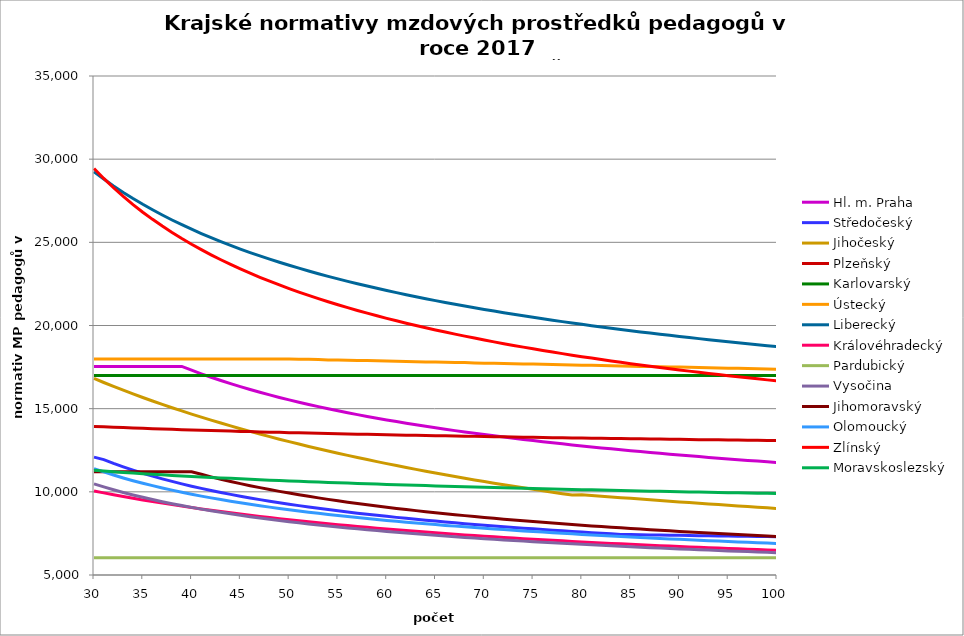
| Category | Hl. m. Praha | Středočeský | Jihočeský | Plzeňský | Karlovarský  | Ústecký   | Liberecký | Královéhradecký | Pardubický | Vysočina | Jihomoravský | Olomoucký | Zlínský | Moravskoslezský |
|---|---|---|---|---|---|---|---|---|---|---|---|---|---|---|
| 30.0 | 17540.399 | 12085.225 | 16815.122 | 13934.228 | 17000 | 17988.82 | 29246.191 | 10051.47 | 6030.48 | 10478.142 | 11210.627 | 11392.527 | 29442.645 | 11294.621 |
| 31.0 | 17540.399 | 11937.305 | 16573.35 | 13910.151 | 17000 | 17988.82 | 28805.839 | 9937.875 | 6030.48 | 10295.455 | 11210.627 | 11195.68 | 28840.823 | 11250.532 |
| 32.0 | 17540.399 | 11711.932 | 16338.432 | 13886.158 | 17000 | 17988.82 | 28391.923 | 9826.82 | 6030.48 | 10124.198 | 11210.627 | 11009.416 | 28281.099 | 11206.787 |
| 33.0 | 17540.399 | 11501.47 | 16110.08 | 13862.247 | 17000 | 17988.82 | 28001.94 | 9718.219 | 6030.48 | 9963.865 | 11210.627 | 10833.02 | 27758.95 | 11167.312 |
| 34.0 | 17540.399 | 11304.396 | 15888.024 | 13838.419 | 17000 | 17988.82 | 27633.704 | 9614.995 | 6030.48 | 9812.78 | 11210.627 | 10669.503 | 27270.491 | 11128.115 |
| 35.0 | 17540.399 | 11119.392 | 15672.006 | 13820.601 | 17000 | 17988.82 | 27285.294 | 9513.941 | 6030.48 | 9670.631 | 11210.627 | 10514.402 | 26812.366 | 11093.072 |
| 36.0 | 17540.399 | 10945.311 | 15461.783 | 13796.915 | 17000 | 17988.82 | 26955.016 | 9414.989 | 6030.48 | 9536.268 | 11210.627 | 10370.657 | 26381.659 | 11058.249 |
| 37.0 | 17540.399 | 10781.15 | 15257.125 | 13779.204 | 17000 | 17988.82 | 26641.368 | 9320.896 | 6030.48 | 9409.216 | 11210.627 | 10230.789 | 25975.823 | 11023.644 |
| 38.0 | 17540.399 | 10626.029 | 15057.815 | 13755.66 | 17000 | 17988.82 | 26343.017 | 9231.434 | 6030.48 | 9288.769 | 11210.627 | 10101.202 | 25592.626 | 10989.255 |
| 39.0 | 17540.399 | 10479.169 | 14863.644 | 13738.055 | 17000 | 17988.82 | 26058.771 | 9140.956 | 6030.48 | 9174.285 | 11210.627 | 9974.856 | 25230.097 | 10955.079 |
| 40.0 | 17313.023 | 10339.882 | 14674.418 | 13720.494 | 17000 | 17988.82 | 25787.563 | 9054.898 | 6030.48 | 9065.439 | 11210.627 | 9857.876 | 24886.497 | 10924.879 |
| 41.0 | 17095.727 | 10207.556 | 14489.949 | 13702.979 | 17000 | 17988.82 | 25528.436 | 8973.061 | 6030.48 | 8961.678 | 11053.999 | 9743.609 | 24560.279 | 10894.845 |
| 42.0 | 16888.863 | 10081.644 | 14310.06 | 13685.508 | 17000 | 17988.82 | 25280.526 | 8890.121 | 6030.48 | 8862.741 | 10901.688 | 9637.93 | 24250.063 | 10864.976 |
| 43.0 | 16691.642 | 9961.656 | 14134.583 | 13668.081 | 17000 | 17988.82 | 25043.052 | 8813.746 | 6030.48 | 8768.146 | 10760.83 | 9534.519 | 23954.618 | 10835.27 |
| 44.0 | 16503.353 | 9847.154 | 13963.357 | 13650.699 | 17000 | 17988.82 | 24815.307 | 8736.191 | 6030.48 | 8677.686 | 10623.565 | 9436.165 | 23672.835 | 10809.41 |
| 45.0 | 16323.356 | 9737.741 | 13796.23 | 13633.362 | 17000 | 17988.82 | 24596.649 | 8662.426 | 6030.48 | 8591.168 | 10493.236 | 9342.625 | 23403.721 | 10780.007 |
| 46.0 | 16151.074 | 9633.06 | 13633.057 | 13621.827 | 17000 | 17988.82 | 24386.493 | 8589.897 | 6030.48 | 8507.955 | 10369.463 | 9250.922 | 23146.374 | 10754.41 |
| 47.0 | 15985.981 | 9532.785 | 13473.698 | 13604.563 | 17000 | 17988.82 | 24184.303 | 8520.93 | 6030.48 | 8428.355 | 10251.895 | 9163.701 | 22899.982 | 10728.934 |
| 48.0 | 15827.601 | 9436.624 | 13318.022 | 13587.342 | 17000 | 17988.82 | 23989.593 | 8453.062 | 6030.48 | 8351.77 | 10136.963 | 9080.759 | 22663.807 | 10703.579 |
| 49.0 | 15675.499 | 9344.308 | 13165.902 | 13575.885 | 17000 | 17988.82 | 23801.912 | 8386.267 | 6030.48 | 8278.077 | 10027.757 | 9001.91 | 22437.176 | 10681.941 |
| 50.0 | 15529.279 | 9255.591 | 13017.218 | 13558.737 | 17000 | 17988.82 | 23620.849 | 8322.769 | 6030.48 | 8206.947 | 9923.989 | 8924.419 | 22219.477 | 10656.807 |
| 51.0 | 15388.578 | 9170.252 | 12871.855 | 13547.329 | 17000 | 17977.654 | 23446.026 | 8260.225 | 6030.48 | 8138.699 | 9825.396 | 8850.768 | 22010.151 | 10631.791 |
| 52.0 | 15253.064 | 9088.084 | 12729.702 | 13530.252 | 17000 | 17966.501 | 23277.093 | 8198.615 | 6030.48 | 8072.605 | 9728.743 | 8778.323 | 21808.684 | 10610.442 |
| 53.0 | 15122.43 | 9008.9 | 12590.655 | 13518.892 | 17000 | 17955.363 | 23113.726 | 8140.069 | 6030.48 | 8008.991 | 9636.906 | 8709.493 | 21614.606 | 10589.178 |
| 54.0 | 14996.395 | 8932.526 | 12454.612 | 13507.55 | 17000 | 17933.127 | 22955.627 | 8082.353 | 6030.48 | 7947.568 | 9546.787 | 8641.734 | 21427.486 | 10568 |
| 55.0 | 14874.699 | 8858.802 | 12321.478 | 13490.574 | 17000 | 17922.03 | 22802.518 | 8025.45 | 6030.48 | 7888.06 | 9461.166 | 8577.386 | 21246.923 | 10546.906 |
| 56.0 | 14757.103 | 8787.582 | 12191.161 | 13479.28 | 17000 | 17910.946 | 22654.143 | 7971.406 | 6030.48 | 7830.403 | 9377.067 | 8513.989 | 21072.552 | 10525.896 |
| 57.0 | 14643.385 | 8718.728 | 12063.571 | 13468.005 | 17000 | 17899.876 | 22510.263 | 7918.086 | 6030.48 | 7774.727 | 9297.18 | 8453.819 | 20904.03 | 10504.97 |
| 58.0 | 14533.339 | 8652.115 | 11938.624 | 13456.749 | 17000 | 17888.82 | 22370.653 | 7865.474 | 6030.48 | 7720.776 | 9221.329 | 8394.494 | 20741.045 | 10484.127 |
| 59.0 | 14426.774 | 8587.625 | 11816.238 | 13445.511 | 17000 | 17877.778 | 22235.108 | 7815.541 | 6030.48 | 7668.497 | 9146.705 | 8338.231 | 20583.304 | 10466.821 |
| 60.0 | 14323.513 | 8525.149 | 11696.337 | 13428.691 | 17000 | 17866.749 | 22103.433 | 7766.238 | 6030.48 | 7617.652 | 9073.28 | 8282.716 | 20430.536 | 10446.129 |
| 61.0 | 14223.391 | 8464.587 | 11578.844 | 13417.5 | 17000 | 17855.734 | 21975.447 | 7717.553 | 6030.48 | 7568.38 | 9003.585 | 8230.114 | 20282.489 | 10428.947 |
| 62.0 | 14126.253 | 8405.843 | 11463.688 | 13406.328 | 17000 | 17833.744 | 21850.98 | 7669.474 | 6030.48 | 7520.634 | 8937.475 | 8178.175 | 20138.928 | 10408.404 |
| 63.0 | 14031.956 | 8348.83 | 11350.801 | 13395.175 | 17000 | 17822.769 | 21729.873 | 7623.879 | 6030.48 | 7474.014 | 8869.843 | 8126.888 | 19999.634 | 10391.347 |
| 64.0 | 13940.365 | 8293.464 | 11240.115 | 13384.04 | 17000 | 17811.808 | 21611.977 | 7578.823 | 6030.48 | 7428.839 | 8808.127 | 8078.338 | 19864.403 | 10374.346 |
| 65.0 | 13851.355 | 8239.67 | 11131.566 | 13378.479 | 17000 | 17800.86 | 21497.152 | 7536.141 | 6030.48 | 7384.895 | 8744.847 | 8030.364 | 19733.043 | 10357.4 |
| 66.0 | 13764.808 | 8187.374 | 11025.095 | 13367.372 | 17000 | 17789.926 | 21385.267 | 7493.937 | 6030.48 | 7342.147 | 8684.852 | 7982.957 | 19605.375 | 10340.509 |
| 67.0 | 13680.613 | 8136.51 | 10920.64 | 13356.284 | 17000 | 17779.006 | 21276.196 | 7452.203 | 6030.48 | 7300.396 | 8625.675 | 7938.132 | 19481.232 | 10323.673 |
| 68.0 | 13598.666 | 8087.014 | 10818.147 | 13345.213 | 17000 | 17768.098 | 21169.824 | 7410.932 | 6030.48 | 7259.782 | 8569.618 | 7893.807 | 19360.456 | 10306.892 |
| 69.0 | 13518.871 | 8038.826 | 10717.559 | 13334.161 | 17000 | 17746.324 | 21066.041 | 7371.88 | 6030.48 | 7220.274 | 8514.286 | 7851.957 | 19242.899 | 10290.166 |
| 70.0 | 13441.135 | 7991.89 | 10618.825 | 13323.128 | 17000 | 17735.456 | 20964.742 | 7331.491 | 6030.48 | 7181.682 | 8461.925 | 7808.586 | 19128.423 | 10273.493 |
| 71.0 | 13365.371 | 7946.153 | 10521.893 | 13317.618 | 17000 | 17724.602 | 20865.828 | 7294.999 | 6030.48 | 7143.984 | 8407.97 | 7767.632 | 19016.896 | 10260.194 |
| 72.0 | 13291.499 | 7901.566 | 10426.715 | 13306.612 | 17000 | 17713.761 | 20769.208 | 7257.156 | 6030.48 | 7107.316 | 8356.905 | 7729.026 | 18908.194 | 10243.619 |
| 73.0 | 13219.442 | 7858.081 | 10333.243 | 13295.623 | 17000 | 17702.934 | 20674.793 | 7221.398 | 6030.48 | 7071.495 | 8308.637 | 7688.9 | 18802.202 | 10230.397 |
| 74.0 | 13149.126 | 7815.654 | 10241.433 | 13284.653 | 17000 | 17692.12 | 20582.5 | 7185.991 | 6030.48 | 7036.503 | 8258.768 | 7651.07 | 18698.81 | 10213.918 |
| 75.0 | 13080.483 | 7774.243 | 10151.239 | 13279.175 | 17000 | 17681.319 | 20492.249 | 7150.929 | 6030.48 | 7002.319 | 8211.624 | 7613.611 | 18597.915 | 10200.772 |
| 76.0 | 13013.448 | 7733.808 | 10062.62 | 13268.232 | 17000 | 17670.531 | 20403.967 | 7117.854 | 6030.48 | 6968.924 | 8167.123 | 7578.363 | 18499.417 | 10184.388 |
| 77.0 | 12947.96 | 7694.313 | 9975.535 | 13257.308 | 17000 | 17648.995 | 20317.581 | 7083.452 | 6030.48 | 6936.151 | 8121.016 | 7541.61 | 18403.225 | 10171.319 |
| 78.0 | 12883.96 | 7655.72 | 9889.945 | 13251.852 | 17000 | 17638.246 | 20233.024 | 7052.612 | 6030.48 | 6904.285 | 8077.489 | 7507.024 | 18309.249 | 10158.283 |
| 79.0 | 12821.394 | 7617.997 | 9805.81 | 13240.954 | 17000 | 17627.511 | 20150.232 | 7020.438 | 6030.48 | 6873.009 | 8034.425 | 7472.753 | 18217.408 | 10145.28 |
| 80.0 | 12760.207 | 7581.112 | 9829.122 | 13235.512 | 17000 | 17616.788 | 20069.143 | 6988.556 | 6030.48 | 6842.457 | 7993.837 | 7440.574 | 18127.622 | 10132.311 |
| 81.0 | 12700.351 | 7545.034 | 9783.93 | 13224.641 | 17000 | 17606.079 | 19989.7 | 6958.535 | 6030.48 | 6812.469 | 7951.658 | 7406.906 | 18039.815 | 10119.374 |
| 82.0 | 12641.778 | 7509.734 | 9739.151 | 13219.212 | 17000 | 17595.383 | 19911.847 | 6928.771 | 6030.48 | 6783.178 | 7911.9 | 7375.29 | 17953.917 | 10106.471 |
| 83.0 | 12584.444 | 7475.184 | 9694.78 | 13208.368 | 17000 | 17584.699 | 19835.531 | 6900.807 | 6030.48 | 6754.425 | 7872.537 | 7343.943 | 17869.86 | 10093.601 |
| 84.0 | 12528.304 | 7441.36 | 9650.812 | 13202.952 | 17000 | 17563.372 | 19760.7 | 6871.534 | 6030.48 | 6726.343 | 7835.504 | 7314.581 | 17787.578 | 10080.763 |
| 85.0 | 12473.319 | 7427.931 | 9607.241 | 13192.134 | 17000 | 17552.727 | 19687.308 | 6844.029 | 6030.48 | 6698.777 | 7796.896 | 7283.747 | 17707.012 | 10067.958 |
| 86.0 | 12419.449 | 7418.56 | 9564.061 | 13186.732 | 17000 | 17542.096 | 19615.309 | 6816.744 | 6030.48 | 6671.716 | 7760.569 | 7254.864 | 17628.101 | 10055.186 |
| 87.0 | 12366.657 | 7409.321 | 9521.268 | 13175.941 | 17000 | 17531.477 | 19544.657 | 6789.676 | 6030.48 | 6645.152 | 7724.579 | 7226.208 | 17550.792 | 10042.445 |
| 88.0 | 12314.908 | 7400.21 | 9478.856 | 13170.552 | 17000 | 17520.871 | 19475.311 | 6764.308 | 6030.48 | 6619.213 | 7688.921 | 7197.778 | 17475.029 | 10029.737 |
| 89.0 | 12264.167 | 7391.224 | 9436.82 | 13159.787 | 17000 | 17510.278 | 19407.231 | 6739.129 | 6030.48 | 6593.749 | 7655.443 | 7169.571 | 17400.762 | 10020.228 |
| 90.0 | 12214.403 | 7382.359 | 9395.156 | 13154.412 | 17000 | 17499.698 | 19340.378 | 6714.136 | 6030.48 | 6568.753 | 7622.254 | 7143.225 | 17327.944 | 10007.576 |
| 91.0 | 12165.584 | 7373.614 | 9353.858 | 13149.04 | 17000 | 17489.13 | 19274.805 | 6689.328 | 6030.48 | 6544.081 | 7587.533 | 7115.443 | 17256.527 | 9994.956 |
| 92.0 | 12117.682 | 7364.984 | 9312.921 | 13138.311 | 17000 | 17468.034 | 19210.385 | 6664.703 | 6030.48 | 6519.996 | 7556.734 | 7089.492 | 17186.468 | 9985.512 |
| 93.0 | 12070.667 | 7356.468 | 9272.341 | 13132.953 | 17000 | 17457.505 | 19147.084 | 6641.692 | 6030.48 | 6496.353 | 7524.394 | 7063.729 | 17117.723 | 9972.947 |
| 94.0 | 12024.512 | 7348.062 | 9232.113 | 13127.599 | 17000 | 17446.988 | 19084.869 | 6618.839 | 6030.48 | 6473.146 | 7492.33 | 7038.153 | 17050.252 | 9963.545 |
| 95.0 | 11979.192 | 7339.764 | 9192.232 | 13116.904 | 17000 | 17436.484 | 19023.709 | 6596.142 | 6030.48 | 6450.235 | 7462.297 | 7014.344 | 16984.017 | 9951.036 |
| 96.0 | 11934.681 | 7331.571 | 9152.695 | 13111.564 | 17000 | 17425.993 | 18963.574 | 6573.601 | 6030.48 | 6427.876 | 7432.504 | 6989.124 | 16918.98 | 9941.675 |
| 97.0 | 11890.956 | 7323.482 | 9113.496 | 13106.227 | 17000 | 17415.514 | 18904.436 | 6552.608 | 6030.48 | 6405.802 | 7402.947 | 6965.644 | 16855.106 | 9929.22 |
| 98.0 | 11847.994 | 7315.492 | 9074.632 | 13095.567 | 17000 | 17405.048 | 18846.266 | 6530.363 | 6030.48 | 6384.007 | 7373.625 | 6942.321 | 16792.36 | 9919.9 |
| 99.0 | 11805.773 | 7307.601 | 9036.098 | 13090.244 | 17000 | 17384.154 | 18789.038 | 6509.645 | 6030.48 | 6362.743 | 7344.535 | 6919.155 | 16730.709 | 9910.597 |
| 100.0 | 11764.272 | 7299.806 | 8997.889 | 13084.925 | 17000 | 17373.725 | 18732.726 | 6489.058 | 6030.48 | 6341.746 | 7317.364 | 6896.142 | 16670.123 | 9898.22 |